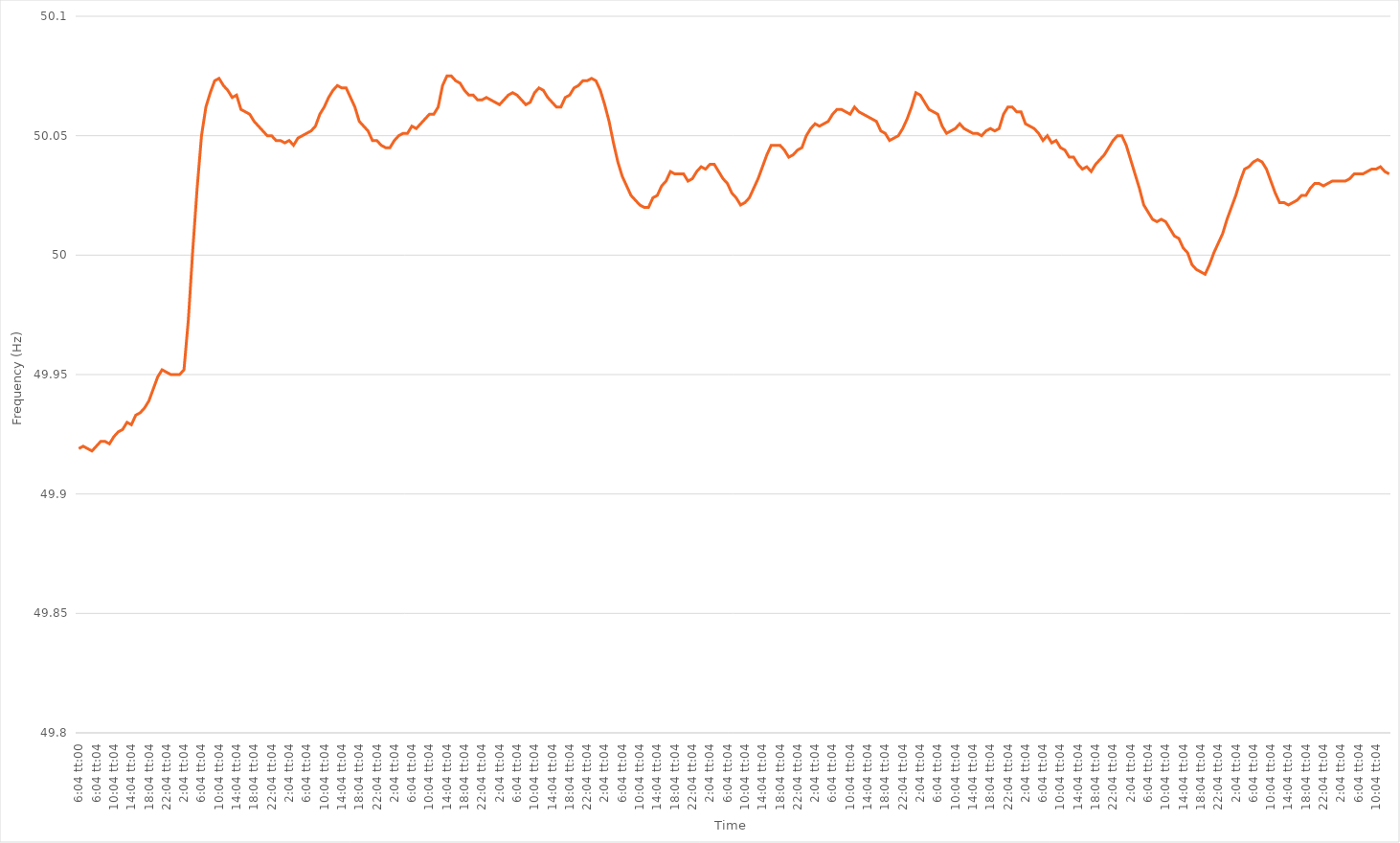
| Category | Series 0 |
|---|---|
| 0.25277777777777777 | 49.919 |
| 0.25278935185185186 | 49.92 |
| 0.2528009259259259 | 49.919 |
| 0.2528125 | 49.918 |
| 0.2528240740740741 | 49.92 |
| 0.294490740740741 | 49.922 |
| 0.336157407407407 | 49.922 |
| 0.377824074074074 | 49.921 |
| 0.419490740740741 | 49.924 |
| 0.461157407407407 | 49.926 |
| 0.502824074074074 | 49.927 |
| 0.544490740740741 | 49.93 |
| 0.586157407407407 | 49.929 |
| 0.627824074074074 | 49.933 |
| 0.669490740740741 | 49.934 |
| 0.711157407407407 | 49.936 |
| 0.752824074074074 | 49.939 |
| 0.794490740740741 | 49.944 |
| 0.836157407407407 | 49.949 |
| 0.877824074074074 | 49.952 |
| 0.919490740740741 | 49.951 |
| 0.961157407407407 | 49.95 |
| 1900-01-01 00:04:04 | 49.95 |
| 1900-01-01 01:04:04 | 49.95 |
| 1900-01-01 02:04:04 | 49.952 |
| 1900-01-01 03:04:04 | 49.973 |
| 1900-01-01 04:04:04 | 50.002 |
| 1900-01-01 05:04:04 | 50.028 |
| 1900-01-01 06:04:04 | 50.05 |
| 1900-01-01 07:04:04 | 50.062 |
| 1900-01-01 08:04:04 | 50.068 |
| 1900-01-01 09:04:04 | 50.073 |
| 1900-01-01 10:04:04 | 50.074 |
| 1900-01-01 11:04:04 | 50.071 |
| 1900-01-01 12:04:04 | 50.069 |
| 1900-01-01 13:04:04 | 50.066 |
| 1900-01-01 14:04:04 | 50.067 |
| 1900-01-01 15:04:04 | 50.061 |
| 1900-01-01 16:04:04 | 50.06 |
| 1900-01-01 17:04:04 | 50.059 |
| 1900-01-01 18:04:04 | 50.056 |
| 1900-01-01 19:04:04 | 50.054 |
| 1900-01-01 20:04:04 | 50.052 |
| 1900-01-01 21:04:04 | 50.05 |
| 1900-01-01 22:04:04 | 50.05 |
| 1900-01-01 23:04:04 | 50.048 |
| 1900-01-02 00:04:04 | 50.048 |
| 1900-01-02 01:04:04 | 50.047 |
| 1900-01-02 02:04:04 | 50.048 |
| 1900-01-02 03:04:04 | 50.046 |
| 1900-01-02 04:04:04 | 50.049 |
| 1900-01-02 05:04:04 | 50.05 |
| 1900-01-02 06:04:04 | 50.051 |
| 1900-01-02 07:04:04 | 50.052 |
| 1900-01-02 08:04:04 | 50.054 |
| 1900-01-02 09:04:04 | 50.059 |
| 1900-01-02 10:04:04 | 50.062 |
| 1900-01-02 11:04:04 | 50.066 |
| 1900-01-02 12:04:04 | 50.069 |
| 1900-01-02 13:04:04 | 50.071 |
| 1900-01-02 14:04:04 | 50.07 |
| 1900-01-02 15:04:04 | 50.07 |
| 1900-01-02 16:04:04 | 50.066 |
| 1900-01-02 17:04:04 | 50.062 |
| 1900-01-02 18:04:04 | 50.056 |
| 1900-01-02 19:04:04 | 50.054 |
| 1900-01-02 20:04:04 | 50.052 |
| 1900-01-02 21:04:04 | 50.048 |
| 1900-01-02 22:04:04 | 50.048 |
| 1900-01-02 23:04:04 | 50.046 |
| 1900-01-03 00:04:04 | 50.045 |
| 1900-01-03 01:04:04 | 50.045 |
| 1900-01-03 02:04:04 | 50.048 |
| 1900-01-03 03:04:04 | 50.05 |
| 1900-01-03 04:04:04 | 50.051 |
| 1900-01-03 05:04:04 | 50.051 |
| 1900-01-03 06:04:04 | 50.054 |
| 1900-01-03 07:04:04 | 50.053 |
| 1900-01-03 08:04:04 | 50.055 |
| 1900-01-03 09:04:04 | 50.057 |
| 1900-01-03 10:04:04 | 50.059 |
| 1900-01-03 11:04:04 | 50.059 |
| 1900-01-03 12:04:04 | 50.062 |
| 1900-01-03 13:04:04 | 50.071 |
| 1900-01-03 14:04:04 | 50.075 |
| 1900-01-03 15:04:04 | 50.075 |
| 1900-01-03 16:04:04 | 50.073 |
| 1900-01-03 17:04:04 | 50.072 |
| 1900-01-03 18:04:04 | 50.069 |
| 1900-01-03 19:04:04 | 50.067 |
| 1900-01-03 20:04:04 | 50.067 |
| 1900-01-03 21:04:04 | 50.065 |
| 1900-01-03 22:04:04 | 50.065 |
| 1900-01-03 23:04:04 | 50.066 |
| 1900-01-04 00:04:04 | 50.065 |
| 1900-01-04 01:04:04 | 50.064 |
| 1900-01-04 02:04:04 | 50.063 |
| 1900-01-04 03:04:04 | 50.065 |
| 1900-01-04 04:04:04 | 50.067 |
| 1900-01-04 05:04:04 | 50.068 |
| 1900-01-04 06:04:04 | 50.067 |
| 1900-01-04 07:04:04 | 50.065 |
| 1900-01-04 08:04:04 | 50.063 |
| 1900-01-04 09:04:04 | 50.064 |
| 1900-01-04 10:04:04 | 50.068 |
| 1900-01-04 11:04:04 | 50.07 |
| 1900-01-04 12:04:04 | 50.069 |
| 1900-01-04 13:04:04 | 50.066 |
| 1900-01-04 14:04:04 | 50.064 |
| 1900-01-04 15:04:04 | 50.062 |
| 1900-01-04 16:04:04 | 50.062 |
| 1900-01-04 17:04:04 | 50.066 |
| 1900-01-04 18:04:04 | 50.067 |
| 1900-01-04 19:04:04 | 50.07 |
| 1900-01-04 20:04:04 | 50.071 |
| 1900-01-04 21:04:04 | 50.073 |
| 1900-01-04 22:04:04 | 50.073 |
| 1900-01-04 23:04:04 | 50.074 |
| 1900-01-05 00:04:04 | 50.073 |
| 1900-01-05 01:04:04 | 50.069 |
| 1900-01-05 02:04:04 | 50.063 |
| 1900-01-05 03:04:04 | 50.056 |
| 1900-01-05 04:04:04 | 50.047 |
| 1900-01-05 05:04:04 | 50.039 |
| 1900-01-05 06:04:04 | 50.033 |
| 1900-01-05 07:04:04 | 50.029 |
| 1900-01-05 08:04:04 | 50.025 |
| 1900-01-05 09:04:04 | 50.023 |
| 1900-01-05 10:04:04 | 50.021 |
| 1900-01-05 11:04:04 | 50.02 |
| 1900-01-05 12:04:04 | 50.02 |
| 1900-01-05 13:04:04 | 50.024 |
| 1900-01-05 14:04:04 | 50.025 |
| 1900-01-05 15:04:04 | 50.029 |
| 1900-01-05 16:04:04 | 50.031 |
| 1900-01-05 17:04:04 | 50.035 |
| 1900-01-05 18:04:04 | 50.034 |
| 1900-01-05 19:04:04 | 50.034 |
| 1900-01-05 20:04:04 | 50.034 |
| 1900-01-05 21:04:04 | 50.031 |
| 1900-01-05 22:04:04 | 50.032 |
| 1900-01-05 23:04:04 | 50.035 |
| 1900-01-06 00:04:04 | 50.037 |
| 1900-01-06 01:04:04 | 50.036 |
| 1900-01-06 02:04:04 | 50.038 |
| 1900-01-06 03:04:04 | 50.038 |
| 1900-01-06 04:04:04 | 50.035 |
| 1900-01-06 05:04:04 | 50.032 |
| 1900-01-06 06:04:04 | 50.03 |
| 1900-01-06 07:04:04 | 50.026 |
| 1900-01-06 08:04:04 | 50.024 |
| 1900-01-06 09:04:04 | 50.021 |
| 1900-01-06 10:04:04 | 50.022 |
| 1900-01-06 11:04:04 | 50.024 |
| 1900-01-06 12:04:04 | 50.028 |
| 1900-01-06 13:04:04 | 50.032 |
| 1900-01-06 14:04:04 | 50.037 |
| 1900-01-06 15:04:04 | 50.042 |
| 1900-01-06 16:04:04 | 50.046 |
| 1900-01-06 17:04:04 | 50.046 |
| 1900-01-06 18:04:04 | 50.046 |
| 1900-01-06 19:04:04 | 50.044 |
| 1900-01-06 20:04:04 | 50.041 |
| 1900-01-06 21:04:04 | 50.042 |
| 1900-01-06 22:04:04 | 50.044 |
| 1900-01-06 23:04:04 | 50.045 |
| 1900-01-07 00:04:04 | 50.05 |
| 1900-01-07 01:04:04 | 50.053 |
| 1900-01-07 02:04:04 | 50.055 |
| 1900-01-07 03:04:04 | 50.054 |
| 1900-01-07 04:04:04 | 50.055 |
| 1900-01-07 05:04:04 | 50.056 |
| 1900-01-07 06:04:04 | 50.059 |
| 1900-01-07 07:04:04 | 50.061 |
| 1900-01-07 08:04:04 | 50.061 |
| 1900-01-07 09:04:04 | 50.06 |
| 1900-01-07 10:04:04 | 50.059 |
| 1900-01-07 11:04:04 | 50.062 |
| 1900-01-07 12:04:04 | 50.06 |
| 1900-01-07 13:04:04 | 50.059 |
| 1900-01-07 14:04:04 | 50.058 |
| 1900-01-07 15:04:04 | 50.057 |
| 1900-01-07 16:04:04 | 50.056 |
| 1900-01-07 17:04:04 | 50.052 |
| 1900-01-07 18:04:04 | 50.051 |
| 1900-01-07 19:04:04 | 50.048 |
| 1900-01-07 20:04:04 | 50.049 |
| 1900-01-07 21:04:04 | 50.05 |
| 1900-01-07 22:04:04 | 50.053 |
| 1900-01-07 23:04:04 | 50.057 |
| 1900-01-08 00:04:04 | 50.062 |
| 1900-01-08 01:04:04 | 50.068 |
| 1900-01-08 02:04:04 | 50.067 |
| 1900-01-08 03:04:04 | 50.064 |
| 1900-01-08 04:04:04 | 50.061 |
| 1900-01-08 05:04:04 | 50.06 |
| 1900-01-08 06:04:04 | 50.059 |
| 1900-01-08 07:04:04 | 50.054 |
| 1900-01-08 08:04:04 | 50.051 |
| 1900-01-08 09:04:04 | 50.052 |
| 1900-01-08 10:04:04 | 50.053 |
| 1900-01-08 11:04:04 | 50.055 |
| 1900-01-08 12:04:04 | 50.053 |
| 1900-01-08 13:04:04 | 50.052 |
| 1900-01-08 14:04:04 | 50.051 |
| 1900-01-08 15:04:04 | 50.051 |
| 1900-01-08 16:04:04 | 50.05 |
| 1900-01-08 17:04:04 | 50.052 |
| 1900-01-08 18:04:04 | 50.053 |
| 1900-01-08 19:04:04 | 50.052 |
| 1900-01-08 20:04:04 | 50.053 |
| 1900-01-08 21:04:04 | 50.059 |
| 1900-01-08 22:04:04 | 50.062 |
| 1900-01-08 23:04:04 | 50.062 |
| 1900-01-09 00:04:04 | 50.06 |
| 1900-01-09 01:04:04 | 50.06 |
| 1900-01-09 02:04:04 | 50.055 |
| 1900-01-09 03:04:04 | 50.054 |
| 1900-01-09 04:04:04 | 50.053 |
| 1900-01-09 05:04:04 | 50.051 |
| 1900-01-09 06:04:04 | 50.048 |
| 1900-01-09 07:04:04 | 50.05 |
| 1900-01-09 08:04:04 | 50.047 |
| 1900-01-09 09:04:04 | 50.048 |
| 1900-01-09 10:04:04 | 50.045 |
| 1900-01-09 11:04:04 | 50.044 |
| 1900-01-09 12:04:04 | 50.041 |
| 1900-01-09 13:04:04 | 50.041 |
| 1900-01-09 14:04:04 | 50.038 |
| 1900-01-09 15:04:04 | 50.036 |
| 1900-01-09 16:04:04 | 50.037 |
| 1900-01-09 17:04:04 | 50.035 |
| 1900-01-09 18:04:04 | 50.038 |
| 1900-01-09 19:04:04 | 50.04 |
| 1900-01-09 20:04:04 | 50.042 |
| 1900-01-09 21:04:04 | 50.045 |
| 1900-01-09 22:04:04 | 50.048 |
| 1900-01-09 23:04:04 | 50.05 |
| 1900-01-10 00:04:04 | 50.05 |
| 1900-01-10 01:04:04 | 50.046 |
| 1900-01-10 02:04:04 | 50.04 |
| 1900-01-10 03:04:04 | 50.034 |
| 1900-01-10 04:04:04 | 50.028 |
| 1900-01-10 05:04:04 | 50.021 |
| 1900-01-10 06:04:04 | 50.018 |
| 1900-01-10 07:04:04 | 50.015 |
| 1900-01-10 08:04:04 | 50.014 |
| 1900-01-10 09:04:04 | 50.015 |
| 1900-01-10 10:04:04 | 50.014 |
| 1900-01-10 11:04:04 | 50.011 |
| 1900-01-10 12:04:04 | 50.008 |
| 1900-01-10 13:04:04 | 50.007 |
| 1900-01-10 14:04:04 | 50.003 |
| 1900-01-10 15:04:04 | 50.001 |
| 1900-01-10 16:04:04 | 49.996 |
| 1900-01-10 17:04:04 | 49.994 |
| 1900-01-10 18:04:04 | 49.993 |
| 1900-01-10 19:04:04 | 49.992 |
| 1900-01-10 20:04:04 | 49.996 |
| 1900-01-10 21:04:04 | 50.001 |
| 1900-01-10 22:04:04 | 50.005 |
| 1900-01-10 23:04:04 | 50.009 |
| 1900-01-11 00:04:04 | 50.015 |
| 1900-01-11 01:04:04 | 50.02 |
| 1900-01-11 02:04:04 | 50.025 |
| 1900-01-11 03:04:04 | 50.031 |
| 1900-01-11 04:04:04 | 50.036 |
| 1900-01-11 05:04:04 | 50.037 |
| 1900-01-11 06:04:04 | 50.039 |
| 1900-01-11 07:04:04 | 50.04 |
| 1900-01-11 08:04:04 | 50.039 |
| 1900-01-11 09:04:04 | 50.036 |
| 1900-01-11 10:04:04 | 50.031 |
| 1900-01-11 11:04:04 | 50.026 |
| 1900-01-11 12:04:04 | 50.022 |
| 1900-01-11 13:04:04 | 50.022 |
| 1900-01-11 14:04:04 | 50.021 |
| 1900-01-11 15:04:04 | 50.022 |
| 1900-01-11 16:04:04 | 50.023 |
| 1900-01-11 17:04:04 | 50.025 |
| 1900-01-11 18:04:04 | 50.025 |
| 1900-01-11 19:04:04 | 50.028 |
| 1900-01-11 20:04:04 | 50.03 |
| 1900-01-11 21:04:04 | 50.03 |
| 1900-01-11 22:04:04 | 50.029 |
| 1900-01-11 23:04:04 | 50.03 |
| 1900-01-12 00:04:04 | 50.031 |
| 1900-01-12 01:04:04 | 50.031 |
| 1900-01-12 02:04:04 | 50.031 |
| 1900-01-12 03:04:04 | 50.031 |
| 1900-01-12 04:04:04 | 50.032 |
| 1900-01-12 05:04:04 | 50.034 |
| 1900-01-12 06:04:04 | 50.034 |
| 1900-01-12 07:04:04 | 50.034 |
| 1900-01-12 08:04:04 | 50.035 |
| 1900-01-12 09:04:04 | 50.036 |
| 1900-01-12 10:04:04 | 50.036 |
| 1900-01-12 11:04:04 | 50.037 |
| 1900-01-12 12:04:04 | 50.035 |
| 1900-01-12 13:04:04 | 50.034 |